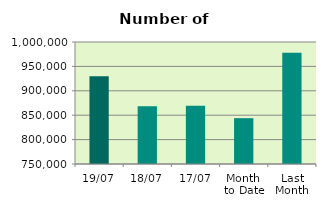
| Category | Series 0 |
|---|---|
| 19/07 | 929868 |
| 18/07 | 868096 |
| 17/07 | 869172 |
| Month 
to Date | 843940 |
| Last
Month | 977938.2 |